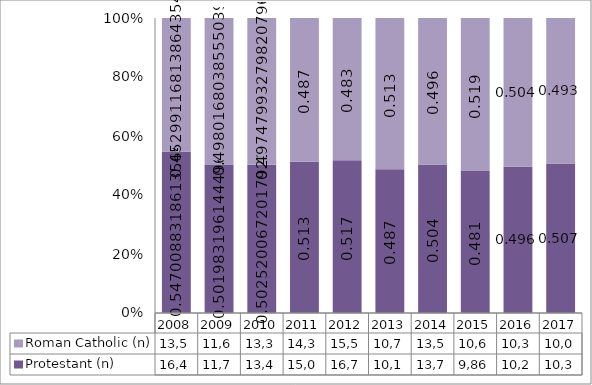
| Category | Protestant (n) | Roman Catholic (n) |
|---|---|---|
| 2008.0 | 16413 | 13592 |
| 2009.0 | 11770 | 11677 |
| 2010.0 | 13460 | 13325 |
| 2011.0 | 15076 | 14339 |
| 2012.0 | 16720 | 15596 |
| 2013.0 | 10195 | 10739 |
| 2014.0 | 13792 | 13592 |
| 2015.0 | 9868 | 10643 |
| 2016.0 | 10215 | 10386 |
| 2017.0 | 10355 | 10082 |